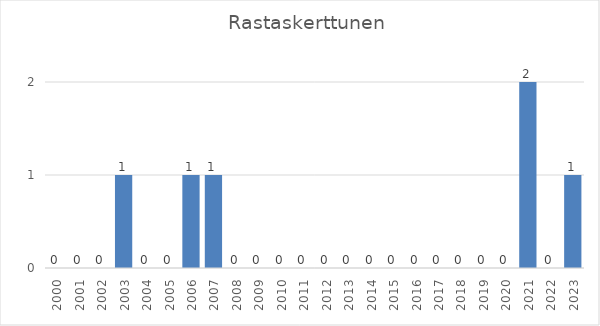
| Category | Series 0 |
|---|---|
| 2000.0 | 0 |
| 2001.0 | 0 |
| 2002.0 | 0 |
| 2003.0 | 1 |
| 2004.0 | 0 |
| 2005.0 | 0 |
| 2006.0 | 1 |
| 2007.0 | 1 |
| 2008.0 | 0 |
| 2009.0 | 0 |
| 2010.0 | 0 |
| 2011.0 | 0 |
| 2012.0 | 0 |
| 2013.0 | 0 |
| 2014.0 | 0 |
| 2015.0 | 0 |
| 2016.0 | 0 |
| 2017.0 | 0 |
| 2018.0 | 0 |
| 2019.0 | 0 |
| 2020.0 | 0 |
| 2021.0 | 2 |
| 2022.0 | 0 |
| 2023.0 | 1 |